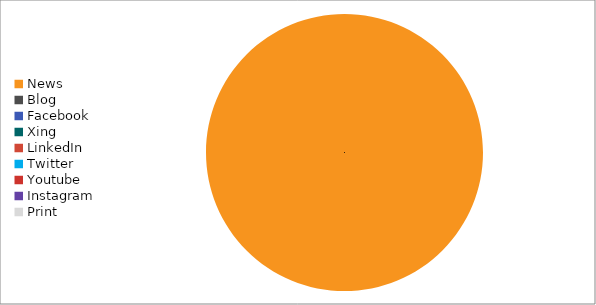
| Category | Series 0 |
|---|---|
| News | 2 |
| Blog | 0 |
| Facebook | 0 |
| Xing | 0 |
| LinkedIn | 0 |
| Twitter | 0 |
| Youtube | 0 |
| Instagram | 0 |
| Print | 0 |